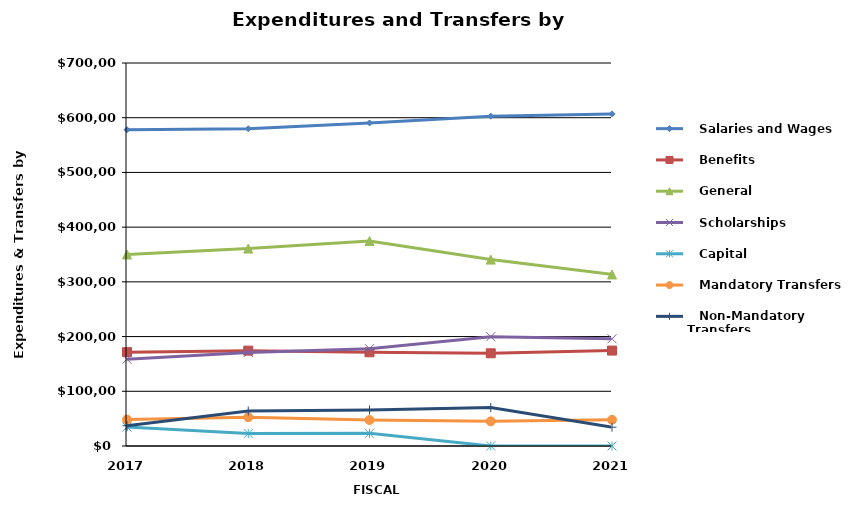
| Category |    Salaries and Wages |    Benefits |    General |    Scholarships |    Capital |    Mandatory Transfers |    Non-Mandatory Transfers |
|---|---|---|---|---|---|---|---|
| 2017.0 | 578049 | 171513 | 350126 | 158591 | 34696 | 48330 | 37088 |
| 2018.0 | 579886 | 174260 | 360879 | 170941 | 22788 | 52677 | 63971 |
| 2019.0 | 590372 | 171278 | 374490 | 177815 | 23236 | 47446 | 65872 |
| 2020.0 | 602803 | 169458 | 340669 | 199854 | 0 | 45109 | 70271 |
| 2021.0 | 606961 | 174409 | 313554 | 196059 | 0 | 47878 | 34428 |